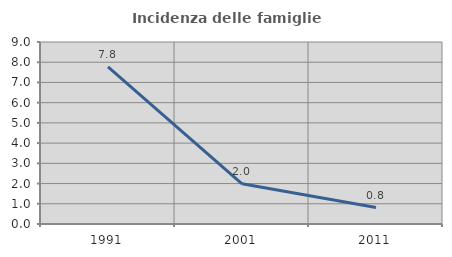
| Category | Incidenza delle famiglie numerose |
|---|---|
| 1991.0 | 7.773 |
| 2001.0 | 1.986 |
| 2011.0 | 0.813 |